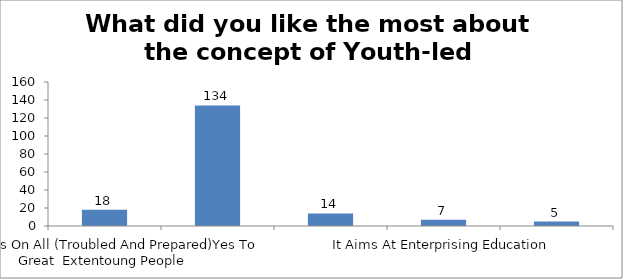
| Category | What did you like the most about the concept of Youth-led Changemaking? |
|---|---|
| It Focuses On All (Troubled And Prepared)Yes To Great  Extentoung People | 18 |
| It Activatesyes To Great  Extentoung People As Changemakers | 134 |
| It Meets Unmet Service Needs Of The Society | 14 |
| It Aims At Enterprising Education | 7 |
| It Redefines The Field Ofyes To Great  Extentouth Development | 5 |